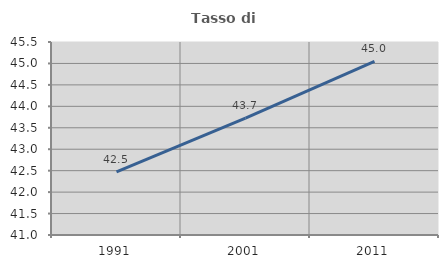
| Category | Tasso di occupazione   |
|---|---|
| 1991.0 | 42.473 |
| 2001.0 | 43.724 |
| 2011.0 | 45.046 |